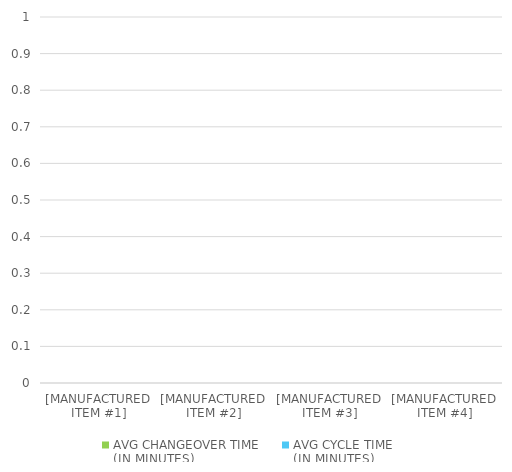
| Category | AVG CHANGEOVER TIME 
(IN MINUTES) | AVG CYCLE TIME 
(IN MINUTES) |
|---|---|---|
| [MANUFACTURED ITEM #1] | 0 | 0 |
| [MANUFACTURED ITEM #2] | 0 | 0 |
| [MANUFACTURED ITEM #3] | 0 | 0 |
| [MANUFACTURED ITEM #4] | 0 | 0 |